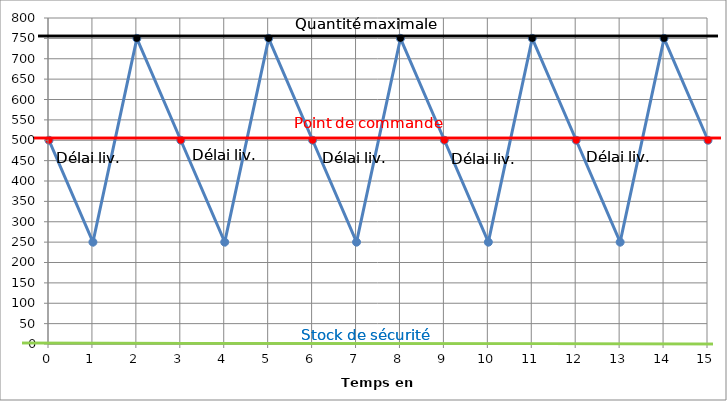
| Category | Series 0 |
|---|---|
| 0.0 | 500 |
| 1.0 | 250 |
| 2.0 | 750 |
| 3.0 | 500 |
| 4.0 | 250 |
| 5.0 | 750 |
| 6.0 | 500 |
| 7.0 | 250 |
| 8.0 | 750 |
| 9.0 | 500 |
| 10.0 | 250 |
| 11.0 | 750 |
| 12.0 | 500 |
| 13.0 | 250 |
| 14.0 | 750 |
| 15.0 | 500 |